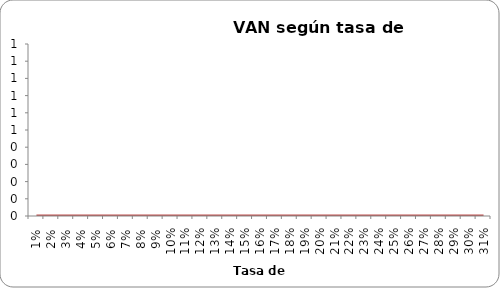
| Category | Series 1 |
|---|---|
| 0.01 | 0 |
| 0.02 | 0 |
| 0.03 | 0 |
| 0.04 | 0 |
| 0.05 | 0 |
| 0.060000000000000005 | 0 |
| 0.07 | 0 |
| 0.08 | 0 |
| 0.09 | 0 |
| 0.09999999999999999 | 0 |
| 0.10999999999999999 | 0 |
| 0.11999999999999998 | 0 |
| 0.12999999999999998 | 0 |
| 0.13999999999999999 | 0 |
| 0.15 | 0 |
| 0.16 | 0 |
| 0.17 | 0 |
| 0.18000000000000002 | 0 |
| 0.19000000000000003 | 0 |
| 0.20000000000000004 | 0 |
| 0.21000000000000005 | 0 |
| 0.22000000000000006 | 0 |
| 0.23000000000000007 | 0 |
| 0.24000000000000007 | 0 |
| 0.25000000000000006 | 0 |
| 0.26000000000000006 | 0 |
| 0.2700000000000001 | 0 |
| 0.2800000000000001 | 0 |
| 0.2900000000000001 | 0 |
| 0.3000000000000001 | 0 |
| 0.3100000000000001 | 0 |